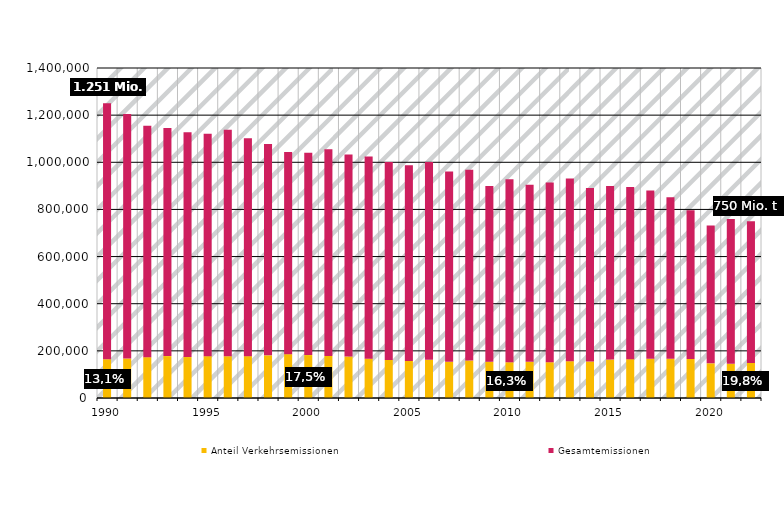
| Category | Anteil Verkehrsemissionen | Gesamtemissionen |
|---|---|---|
| 1990.0 | 164457.251 | 1086200.935 |
| nan | 167461.852 | 1037188.946 |
| nan | 173313.988 | 981744.009 |
| nan | 177705.092 | 968173.546 |
| nan | 173697.141 | 954058.388 |
| 1995.0 | 177469.025 | 943128.845 |
| nan | 177212.816 | 960646.977 |
| nan | 177559.736 | 924546.226 |
| nan | 180846.451 | 896789.91 |
| nan | 185974.195 | 857424.817 |
| 2000.0 | 182017.615 | 858415.377 |
| nan | 178203.65 | 876885.934 |
| nan | 175805.123 | 857553.783 |
| nan | 166740.408 | 857984.569 |
| nan | 161164.572 | 840060.358 |
| 2005.0 | 157059.895 | 830461.752 |
| nan | 161970.468 | 839027.892 |
| nan | 153820.297 | 806928.875 |
| nan | 158813.844 | 809785.419 |
| nan | 153349.879 | 746452.658 |
| 2010.0 | 151639.154 | 776272.598 |
| nan | 153548.155 | 750760.029 |
| nan | 151891.01 | 762606.737 |
| nan | 156168.784 | 775305.67 |
| nan | 155060.771 | 735826.293 |
| 2015.0 | 162925.784 | 736458.047 |
| nan | 164863.642 | 729846.253 |
| nan | 166444.44 | 713397.468 |
| nan | 166727.387 | 684967.955 |
| nan | 165533.616 | 631225.851 |
| 2020.0 | 147163.156 | 584591.641 |
| nan | 145247.71 | 614352.294 |
| nan | 148628.666 | 601336.336 |